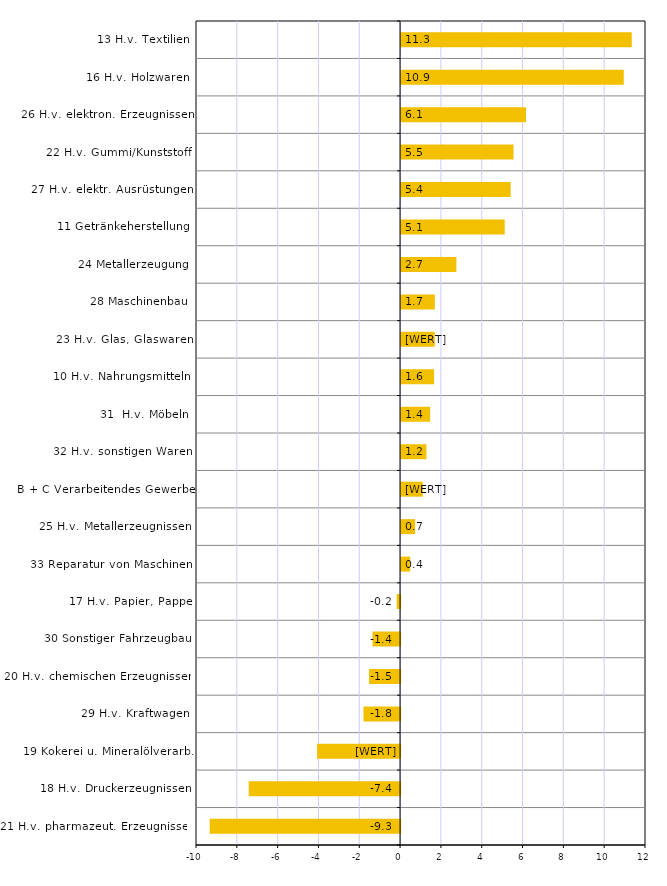
| Category | Series 0 |
|---|---|
| 21 H.v. pharmazeut. Erzeugnissen | -9.328 |
| 18 H.v. Druckerzeugnissen | -7.416 |
| 19 Kokerei u. Mineralölverarb. | -4.067 |
| 29 H.v. Kraftwagen | -1.794 |
| 20 H.v. chemischen Erzeugnissen | -1.52 |
| 30 Sonstiger Fahrzeugbau | -1.352 |
| 17 H.v. Papier, Pappe | -0.166 |
| 33 Reparatur von Maschinen | 0.446 |
| 25 H.v. Metallerzeugnissen | 0.686 |
| B + C Verarbeitendes Gewerbe | 1.06 |
| 32 H.v. sonstigen Waren | 1.242 |
| 31  H.v. Möbeln | 1.423 |
| 10 H.v. Nahrungsmitteln | 1.616 |
| 23 H.v. Glas, Glaswaren | 1.649 |
| 28 Maschinenbau | 1.654 |
| 24 Metallerzeugung | 2.709 |
| 11 Getränkeherstellung | 5.078 |
| 27 H.v. elektr. Ausrüstungen | 5.368 |
| 22 H.v. Gummi/Kunststoff | 5.509 |
| 26 H.v. elektron. Erzeugnissen | 6.12 |
| 16 H.v. Holzwaren | 10.911 |
| 13 H.v. Textilien | 11.303 |